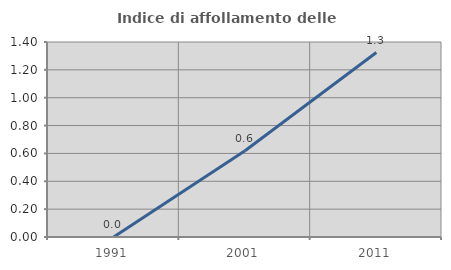
| Category | Indice di affollamento delle abitazioni  |
|---|---|
| 1991.0 | 0 |
| 2001.0 | 0.619 |
| 2011.0 | 1.325 |